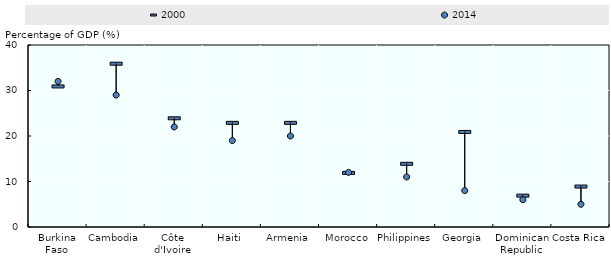
| Category | 2000 | 2014 |
|---|---|---|
| Burkina Faso | 31 | 32 |
| Cambodia | 36 | 29 |
| Côte d'Ivoire | 24 | 22 |
| Haiti | 23 | 19 |
| Armenia | 23 | 20 |
| Morocco | 12 | 12 |
| Philippines | 14 | 11 |
| Georgia | 21 | 8 |
| Dominican Republic | 7 | 6 |
| Costa Rica | 9 | 5 |